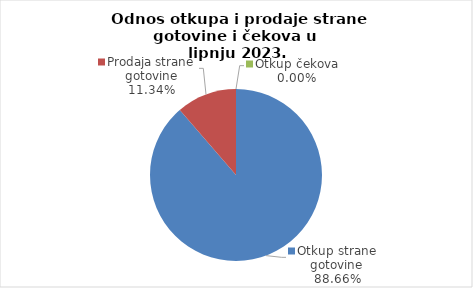
| Category | Series 0 |
|---|---|
| Otkup strane gotovine | 88.663 |
| Prodaja strane gotovine | 11.337 |
| Otkup čekova | 0 |